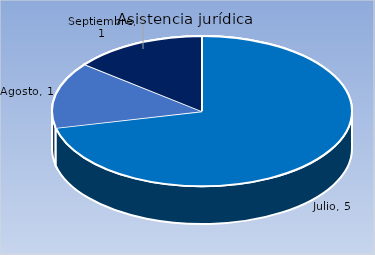
| Category | Cantidad |
|---|---|
| Julio | 5 |
| Agosto | 1 |
| Septiembre | 1 |